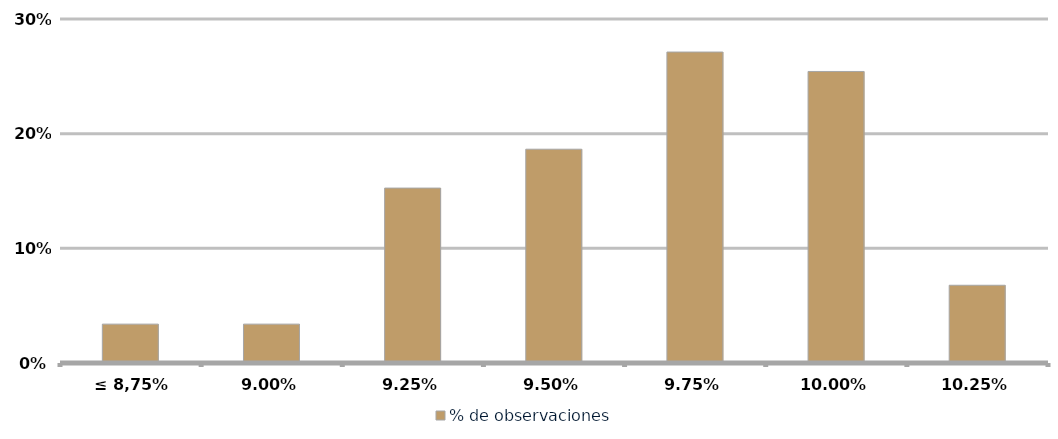
| Category | % de observaciones  |
|---|---|
| ≤ 8,75% | 0.034 |
| 9,00% | 0.034 |
| 9,25% | 0.153 |
| 9,50% | 0.186 |
| 9,75% | 0.271 |
| 10,00% | 0.254 |
| 10,25% | 0.068 |